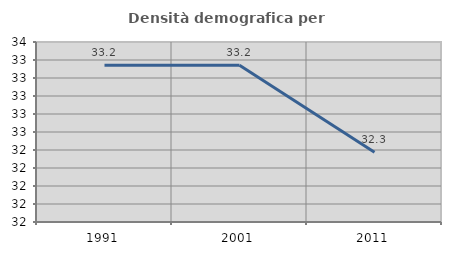
| Category | Densità demografica |
|---|---|
| 1991.0 | 33.241 |
| 2001.0 | 33.241 |
| 2011.0 | 32.275 |